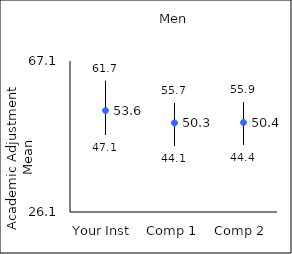
| Category | 25th percentile | 75th percentile | Mean |
|---|---|---|---|
| Your Inst | 47.1 | 61.7 | 53.64 |
| Comp 1 | 44.1 | 55.7 | 50.29 |
| Comp 2 | 44.4 | 55.9 | 50.4 |